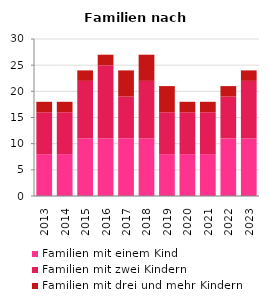
| Category | Familien mit einem Kind | Familien mit zwei Kindern | Familien mit drei und mehr Kindern |
|---|---|---|---|
| 2013.0 | 8 | 8 | 2 |
| 2014.0 | 8 | 8 | 2 |
| 2015.0 | 11 | 11 | 2 |
| 2016.0 | 11 | 14 | 2 |
| 2017.0 | 11 | 8 | 5 |
| 2018.0 | 11 | 11 | 5 |
| 2019.0 | 8 | 8 | 5 |
| 2020.0 | 8 | 8 | 2 |
| 2021.0 | 8 | 8 | 2 |
| 2022.0 | 11 | 8 | 2 |
| 2023.0 | 11 | 11 | 2 |